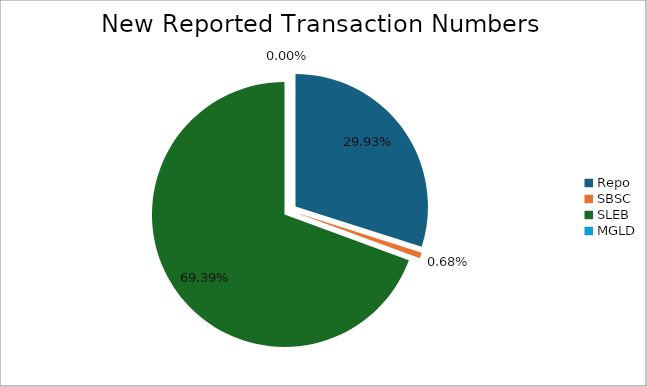
| Category | Series 0 |
|---|---|
| Repo | 347497 |
| SBSC | 7879 |
| SLEB | 805747 |
| MGLD | 31 |